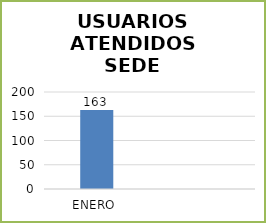
| Category | Series 0 |
|---|---|
| ENERO  | 163 |